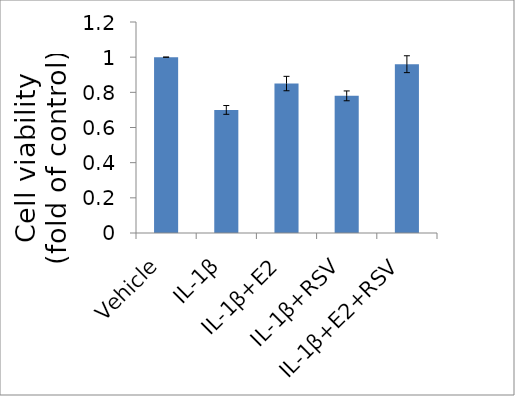
| Category | Series 0 |
|---|---|
| Vehicle | 1 |
| IL-1β | 0.7 |
| IL-1β+E2 | 0.85 |
| IL-1β+RSV | 0.78 |
| IL-1β+E2+RSV | 0.96 |